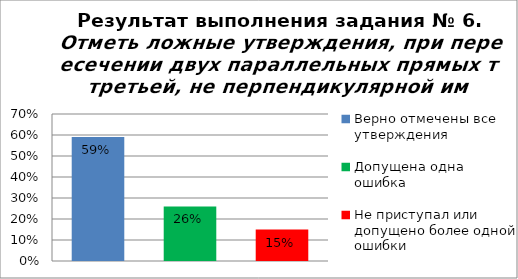
| Category | Отметь ложные утверждения, при пересечении двух параллельных прямых третьей, не перпендикулярной им. |
|---|---|
| Верно отмечены все утверждения | 0.59 |
| Допущена одна ошибка | 0.26 |
| Не приступал или допущено более одной ошибки | 0.15 |